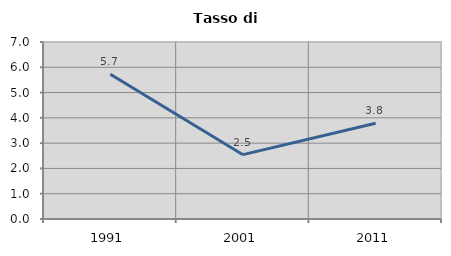
| Category | Tasso di disoccupazione   |
|---|---|
| 1991.0 | 5.723 |
| 2001.0 | 2.545 |
| 2011.0 | 3.785 |